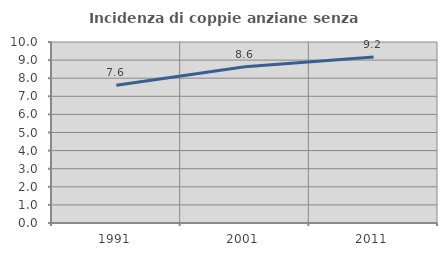
| Category | Incidenza di coppie anziane senza figli  |
|---|---|
| 1991.0 | 7.612 |
| 2001.0 | 8.636 |
| 2011.0 | 9.168 |